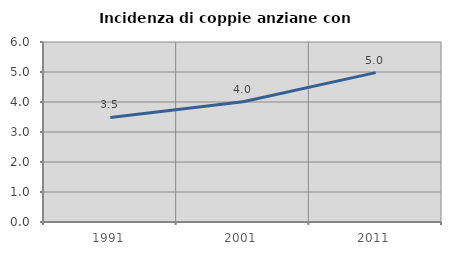
| Category | Incidenza di coppie anziane con figli |
|---|---|
| 1991.0 | 3.487 |
| 2001.0 | 4.009 |
| 2011.0 | 4.978 |